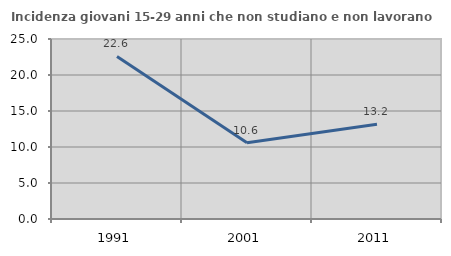
| Category | Incidenza giovani 15-29 anni che non studiano e non lavorano  |
|---|---|
| 1991.0 | 22.581 |
| 2001.0 | 10.595 |
| 2011.0 | 13.154 |